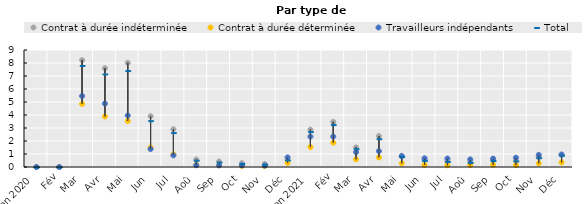
| Category | Contrat à durée indéterminée | Contrat à durée déterminée | Travailleurs indépendants | Total |
|---|---|---|---|---|
| Jan 2020 | 0 | 0 | 0 | 0 |
| Fév | 0 | 0 | 0 | 0 |
| Mar | 8.22 | 4.851 | 5.46 | 7.812 |
| Avr | 7.596 | 3.887 | 4.877 | 7.159 |
| Mai | 8.015 | 3.543 | 3.961 | 7.419 |
| Jun | 3.904 | 1.497 | 1.381 | 3.565 |
| Jul | 2.9 | 0.979 | 0.893 | 2.645 |
| Aoû | 0.576 | 0.175 | 0.137 | 0.522 |
| Sep | 0.417 | 0.125 | 0.129 | 0.378 |
| Oct | 0.297 | 0.082 | 0.129 | 0.27 |
| Nov | 0.231 | 0.068 | 0.111 | 0.211 |
| Déc | 0.543 | 0.314 | 0.735 | 0.538 |
| Jan 2021 | 2.874 | 1.53 | 2.338 | 2.724 |
| Fév | 3.471 | 1.871 | 2.342 | 3.263 |
| Mar | 1.506 | 0.592 | 1.147 | 1.407 |
| Avr | 2.378 | 0.735 | 1.224 | 2.176 |
| Mai | 0.851 | 0.278 | 0.836 | 0.802 |
| Jun | 0.531 | 0.156 | 0.668 | 0.507 |
| Jul | 0.437 | 0.132 | 0.652 | 0.426 |
| Aoû | 0.362 | 0.137 | 0.588 | 0.357 |
| Sep | 0.517 | 0.174 | 0.645 | 0.495 |
| Oct | 0.483 | 0.145 | 0.716 | 0.469 |
| Nov | 0.751 | 0.281 | 0.933 | 0.722 |
| Déc | 0.948 | 0.354 | 0.956 | 0.908 |